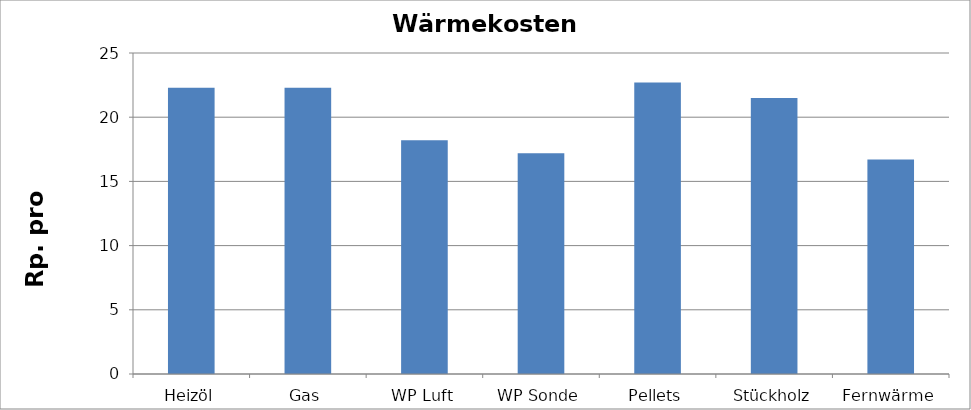
| Category | Wärmekosten [Rp./kWh] |
|---|---|
| Heizöl | 22.3 |
| Gas | 22.3 |
| WP Luft | 18.2 |
| WP Sonde | 17.2 |
| Pellets | 22.7 |
| Stückholz | 21.5 |
| Fernwärme | 16.7 |